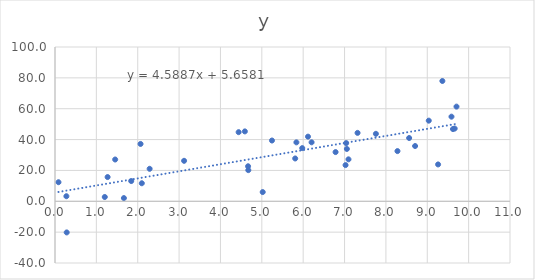
| Category | y |
|---|---|
| 5.245508617509796 | 39.387 |
| 5.021413050784986 | 5.977 |
| 1.2032554004226559 | 2.778 |
| 8.561840216281746 | 41.007 |
| 1.8431722009840545 | 13.115 |
| 5.807096419182534 | 27.748 |
| 0.08402558640770885 | 12.359 |
| 4.673531933172157 | 20.189 |
| 9.036147557243149 | 52.258 |
| 2.287839425144036 | 21.049 |
| 0.2829290481273672 | -20.186 |
| 9.261422873244353 | 23.886 |
| 4.43946994115437 | 44.801 |
| 9.620888381292264 | 46.813 |
| 0.2753332238440087 | 3.284 |
| 2.068129133208896 | 37.161 |
| 8.279614956585261 | 32.531 |
| 5.836191722413593 | 38.198 |
| 4.58979579050224 | 45.299 |
| 7.02430390769613 | 23.452 |
| 6.783058452258088 | 31.896 |
| 7.314641243669015 | 44.332 |
| 4.667652766731343 | 22.697 |
| 6.116612747139099 | 41.896 |
| 7.757996010969853 | 43.723 |
| 7.094881722808051 | 27.187 |
| 1.2718332958100143 | 15.705 |
| 9.70643673316303 | 61.355 |
| 7.039423182075963 | 37.71 |
| 2.098624177757844 | 11.688 |
| 9.662898314106048 | 47.146 |
| 1.4548520279378152 | 27.083 |
| 3.120901525585651 | 26.229 |
| 1.6655468441310106 | 2.078 |
| 6.203262845079397 | 38.224 |
| 8.705715997311831 | 35.82 |
| 9.364967386287194 | 77.968 |
| 9.585429427615574 | 54.846 |
| 5.977120751991576 | 34.46 |
| 7.056136633536603 | 33.926 |